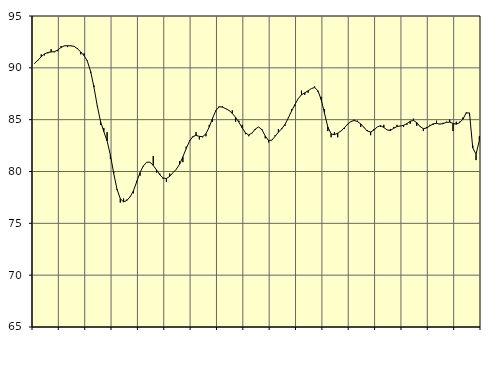
| Category | Piggar | Series 1 |
|---|---|---|
| nan | 90.4 | 90.44 |
| 87.0 | 90.7 | 90.74 |
| 87.0 | 91.3 | 91.07 |
| 87.0 | 91.2 | 91.34 |
| nan | 91.4 | 91.48 |
| 88.0 | 91.8 | 91.53 |
| 88.0 | 91.5 | 91.56 |
| 88.0 | 91.6 | 91.71 |
| nan | 92.1 | 91.96 |
| 89.0 | 92.1 | 92.12 |
| 89.0 | 92 | 92.13 |
| 89.0 | 92.1 | 92.13 |
| nan | 92.1 | 92.07 |
| 90.0 | 91.9 | 91.84 |
| 90.0 | 91.3 | 91.53 |
| 90.0 | 91.4 | 91.18 |
| nan | 90.7 | 90.64 |
| 91.0 | 89.5 | 89.65 |
| 91.0 | 88.3 | 88.14 |
| 91.0 | 86.3 | 86.34 |
| nan | 84.5 | 84.83 |
| 92.0 | 84.2 | 83.85 |
| 92.0 | 83.8 | 82.94 |
| 92.0 | 81.2 | 81.58 |
| nan | 80 | 79.82 |
| 93.0 | 78.2 | 78.29 |
| 93.0 | 77 | 77.37 |
| 93.0 | 77.4 | 77.07 |
| nan | 77.3 | 77.21 |
| 94.0 | 77.6 | 77.56 |
| 94.0 | 77.9 | 78.15 |
| 94.0 | 79.1 | 79.02 |
| nan | 79.6 | 79.9 |
| 95.0 | 80.5 | 80.54 |
| 95.0 | 80.9 | 80.89 |
| 95.0 | 80.9 | 80.9 |
| nan | 81.5 | 80.59 |
| 96.0 | 79.9 | 80.15 |
| 96.0 | 79.8 | 79.68 |
| 96.0 | 79.3 | 79.37 |
| nan | 79 | 79.32 |
| 97.0 | 79.8 | 79.54 |
| 97.0 | 79.9 | 79.89 |
| 97.0 | 80.2 | 80.22 |
| nan | 81 | 80.7 |
| 98.0 | 80.9 | 81.42 |
| 98.0 | 82.4 | 82.21 |
| 98.0 | 83 | 82.91 |
| nan | 83.3 | 83.37 |
| 99.0 | 83.8 | 83.48 |
| 99.0 | 83.1 | 83.39 |
| 99.0 | 83.3 | 83.36 |
| nan | 83.4 | 83.64 |
| 0.0 | 84.5 | 84.29 |
| 0.0 | 84.8 | 85.13 |
| 0.0 | 85.8 | 85.87 |
| nan | 86.3 | 86.24 |
| 1.0 | 86.3 | 86.21 |
| 1.0 | 86.1 | 86.06 |
| 1.0 | 85.9 | 85.89 |
| nan | 85.9 | 85.61 |
| 2.0 | 84.8 | 85.22 |
| 2.0 | 84.9 | 84.75 |
| 2.0 | 84.5 | 84.21 |
| nan | 83.6 | 83.72 |
| 3.0 | 83.4 | 83.52 |
| 3.0 | 83.7 | 83.71 |
| 3.0 | 84 | 84.1 |
| nan | 84.3 | 84.3 |
| 4.0 | 84.1 | 84.02 |
| 4.0 | 83.2 | 83.43 |
| 4.0 | 82.8 | 82.99 |
| nan | 83 | 83.02 |
| 5.0 | 83.5 | 83.4 |
| 5.0 | 84.1 | 83.79 |
| 5.0 | 84.2 | 84.12 |
| nan | 84.4 | 84.54 |
| 6.0 | 85.2 | 85.16 |
| 6.0 | 86 | 85.84 |
| 6.0 | 86.3 | 86.45 |
| nan | 87 | 87.02 |
| 7.0 | 87.8 | 87.4 |
| 7.0 | 87.4 | 87.59 |
| 7.0 | 87.6 | 87.78 |
| nan | 88 | 88 |
| 8.0 | 88.2 | 88.1 |
| 8.0 | 87.7 | 87.79 |
| 8.0 | 87.2 | 86.92 |
| nan | 86 | 85.61 |
| 9.0 | 83.9 | 84.29 |
| 9.0 | 83.3 | 83.63 |
| 9.0 | 83.8 | 83.55 |
| nan | 83.3 | 83.69 |
| 10.0 | 83.9 | 83.91 |
| 10.0 | 84.1 | 84.21 |
| 10.0 | 84.5 | 84.56 |
| nan | 84.8 | 84.82 |
| 11.0 | 85 | 84.92 |
| 11.0 | 84.9 | 84.82 |
| 11.0 | 84.3 | 84.59 |
| nan | 84.2 | 84.24 |
| 12.0 | 84 | 83.9 |
| 12.0 | 83.5 | 83.81 |
| 12.0 | 84.1 | 83.99 |
| nan | 84.3 | 84.3 |
| 13.0 | 84.3 | 84.42 |
| 13.0 | 84.5 | 84.25 |
| 13.0 | 84 | 84.01 |
| nan | 84.1 | 83.96 |
| 14.0 | 84.3 | 84.17 |
| 14.0 | 84.5 | 84.34 |
| 14.0 | 84.4 | 84.39 |
| nan | 84.3 | 84.45 |
| 15.0 | 84.5 | 84.62 |
| 15.0 | 84.6 | 84.85 |
| 15.0 | 85.1 | 84.92 |
| nan | 84.4 | 84.72 |
| 16.0 | 84.3 | 84.34 |
| 16.0 | 83.9 | 84.13 |
| 16.0 | 84.3 | 84.2 |
| nan | 84.5 | 84.41 |
| 17.0 | 84.5 | 84.6 |
| 17.0 | 84.9 | 84.64 |
| 17.0 | 84.6 | 84.57 |
| nan | 84.7 | 84.62 |
| 18.0 | 84.8 | 84.74 |
| 18.0 | 85 | 84.76 |
| 18.0 | 83.9 | 84.64 |
| nan | 84.8 | 84.56 |
| 19.0 | 84.8 | 84.71 |
| 19.0 | 85.2 | 85.04 |
| 19.0 | 85.7 | 85.65 |
| nan | 85.4 | 85.65 |
| 20.0 | 82.5 | 82.28 |
| 20.0 | 81.1 | 81.67 |
| 20.0 | 83.4 | 83 |